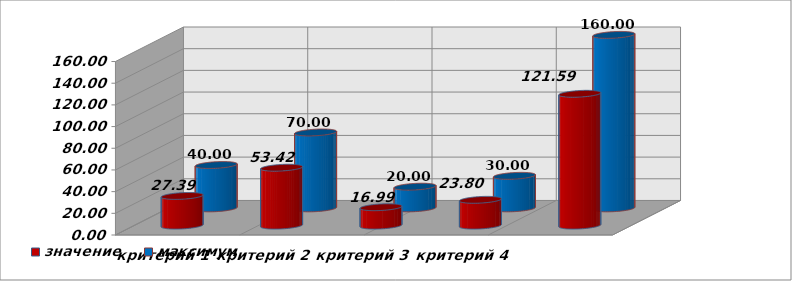
| Category | значение | максимум |
|---|---|---|
| критерий 1 | 27.386 | 40 |
| критерий 2 | 53.419 | 70 |
| критерий 3 | 16.988 | 20 |
| критерий 4 | 23.799 | 30 |